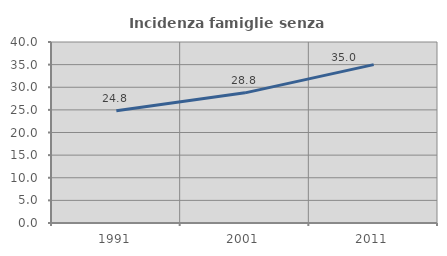
| Category | Incidenza famiglie senza nuclei |
|---|---|
| 1991.0 | 24.802 |
| 2001.0 | 28.764 |
| 2011.0 | 35 |